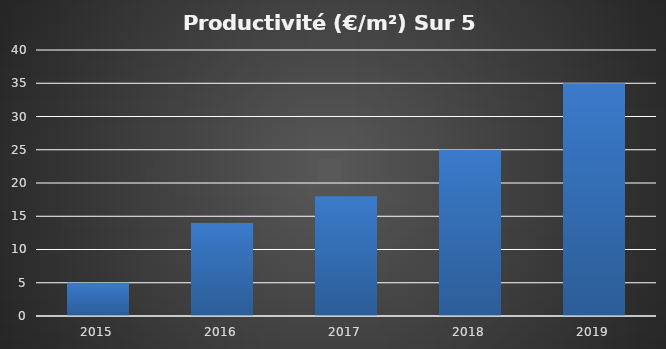
| Category | Series 0 |
|---|---|
| 2015 | 5 |
| 2016 | 14 |
| 2017 | 18 |
| 2018 | 25 |
| 2019 | 35 |